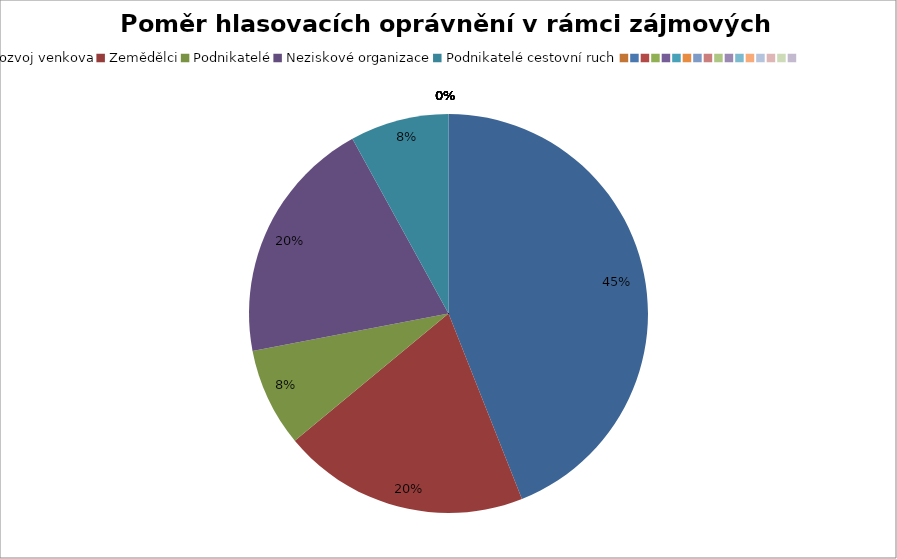
| Category | Series 0 |
|---|---|
| Rozvoj venkova | 0.44 |
| Zemědělci | 0.2 |
| Podnikatelé | 0.08 |
| Neziskové organizace | 0.2 |
| Podnikatelé cestovní ruch | 0.08 |